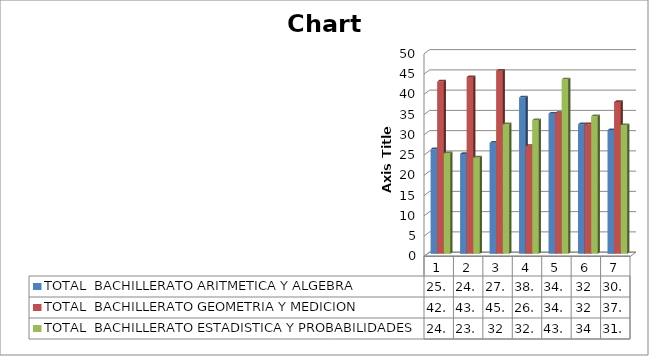
| Category | TOTAL  BACHILLERATO ARITMETICA Y ALGEBRA | TOTAL  BACHILLERATO GEOMETRIA Y MEDICION | TOTAL  BACHILLERATO ESTADISTICA Y PROBABILIDADES |
|---|---|---|---|
| 0 | 25.86 | 42.54 | 24.84 |
| 1 | 24.67 | 43.64 | 23.8 |
| 2 | 27.42 | 45.22 | 32 |
| 3 | 38.63 | 26.66 | 32.99 |
| 4 | 34.62 | 34.81 | 43.09 |
| 5 | 32 | 32 | 34 |
| 6 | 30.533 | 37.478 | 31.787 |